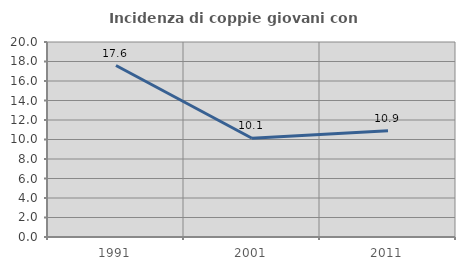
| Category | Incidenza di coppie giovani con figli |
|---|---|
| 1991.0 | 17.587 |
| 2001.0 | 10.133 |
| 2011.0 | 10.896 |